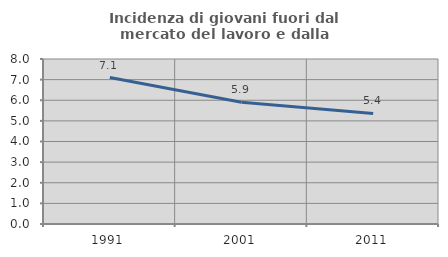
| Category | Incidenza di giovani fuori dal mercato del lavoro e dalla formazione  |
|---|---|
| 1991.0 | 7.099 |
| 2001.0 | 5.9 |
| 2011.0 | 5.358 |